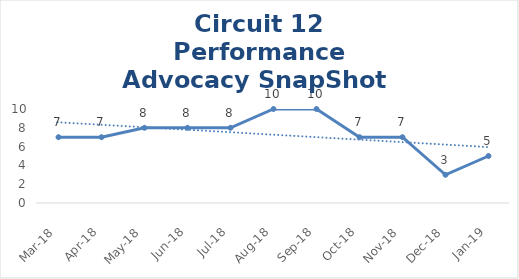
| Category | Circuit 12 |
|---|---|
| Mar-18 | 7 |
| Apr-18 | 7 |
| May-18 | 8 |
| Jun-18 | 8 |
| Jul-18 | 8 |
| Aug-18 | 10 |
| Sep-18 | 10 |
| Oct-18 | 7 |
| Nov-18 | 7 |
| Dec-18 | 3 |
| Jan-19 | 5 |